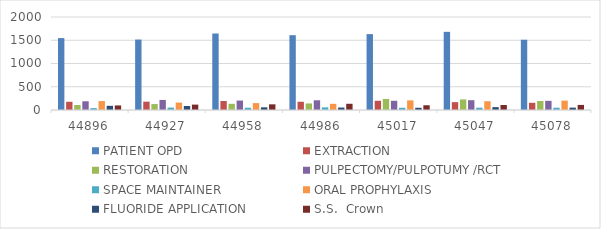
| Category | PATIENT OPD | EXTRACTION | RESTORATION | PULPECTOMY/PULPOTUMY /RCT | SPACE MAINTAINER | ORAL PROPHYLAXIS | FLUORIDE APPLICATION | S.S.  Crown  |
|---|---|---|---|---|---|---|---|---|
| 2022-12-01 | 1546 | 177 | 108 | 188 | 40 | 192 | 90 | 98 |
| 2023-01-01 | 1515 | 179 | 128 | 216 | 52 | 159 | 86 | 116 |
| 2023-02-01 | 1645 | 193 | 133 | 203 | 49 | 148 | 58 | 122 |
| 2023-03-01 | 1609 | 177 | 141 | 209 | 57 | 133 | 53 | 134 |
| 2023-04-01 | 1632 | 198 | 238 | 198 | 48 | 207 | 48 | 102 |
| 2023-05-01 | 1681 | 169 | 227 | 211 | 50 | 189 | 62 | 107 |
| 2023-06-01 | 1511 | 155 | 193 | 197 | 49 | 201 | 51 | 109 |